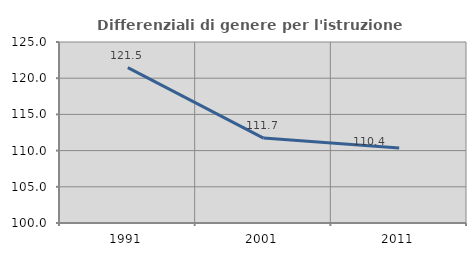
| Category | Differenziali di genere per l'istruzione superiore |
|---|---|
| 1991.0 | 121.452 |
| 2001.0 | 111.725 |
| 2011.0 | 110.357 |